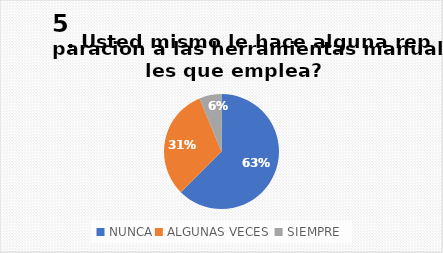
| Category |  Usted mismo le hace alguna reparacion a las herramientas manuales que emplea? |
|---|---|
| NUNCA | 62.5 |
| ALGUNAS VECES  | 31.25 |
| SIEMPRE | 6.25 |